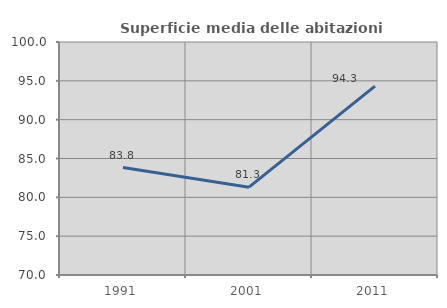
| Category | Superficie media delle abitazioni occupate |
|---|---|
| 1991.0 | 83.83 |
| 2001.0 | 81.305 |
| 2011.0 | 94.323 |